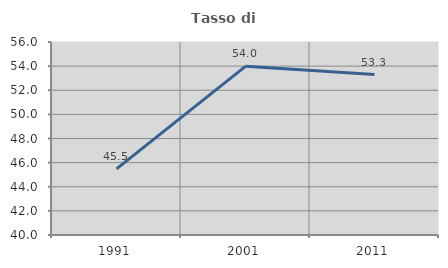
| Category | Tasso di occupazione   |
|---|---|
| 1991.0 | 45.482 |
| 2001.0 | 53.981 |
| 2011.0 | 53.297 |